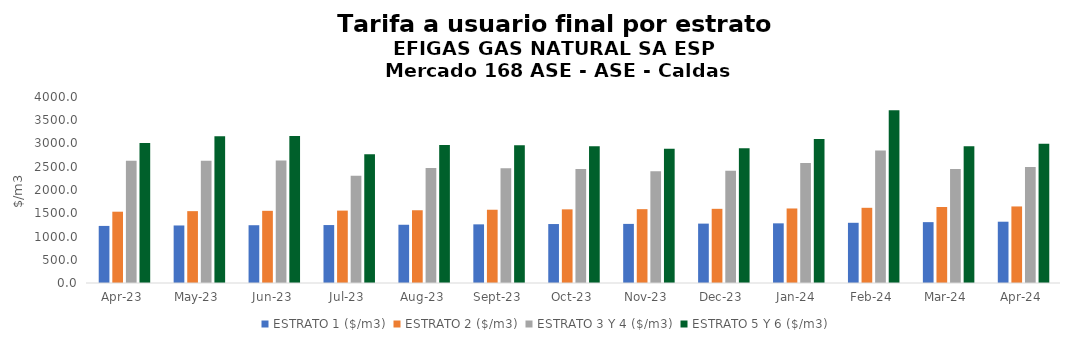
| Category | ESTRATO 1 ($/m3) | ESTRATO 2 ($/m3) | ESTRATO 3 Y 4 ($/m3) | ESTRATO 5 Y 6 ($/m3) |
|---|---|---|---|---|
| 2023-04-01 | 1227.57 | 1533.36 | 2628.313 | 3011.997 |
| 2023-05-01 | 1237.16 | 1545.35 | 2628.313 | 3153.975 |
| 2023-06-01 | 1242.57 | 1552.1 | 2634.476 | 3161.371 |
| 2023-07-01 | 1246.29 | 1556.75 | 2305.861 | 2767.033 |
| 2023-08-01 | 1252.53 | 1564.55 | 2473.749 | 2968.499 |
| 2023-09-01 | 1261.29 | 1575.49 | 2470.388 | 2964.465 |
| 2023-10-01 | 1268 | 1583.87 | 2451.642 | 2941.971 |
| 2023-11-01 | 1271.17 | 1587.82 | 2405.876 | 2887.051 |
| 2023-12-01 | 1277.13 | 1595.27 | 2413.103 | 2895.724 |
| 2024-01-01 | 1283 | 1602.6 | 2580.834 | 3097.001 |
| 2024-02-01 | 1294.73 | 1617.26 | 2850.144 | 3716.401 |
| 2024-03-01 | 1308.8 | 1634.83 | 2449.261 | 2939.113 |
| 2024-04-01 | 1318.02 | 1646.35 | 2493.575 | 2992.29 |